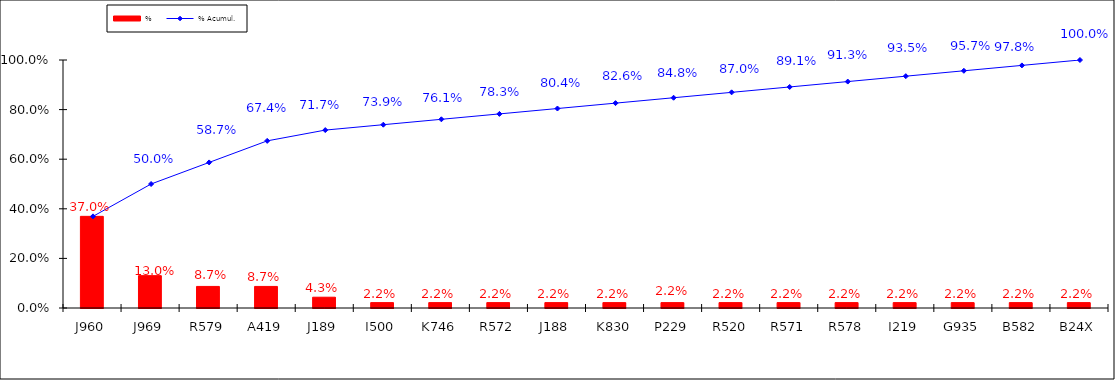
| Category | % |
|---|---|
| J960 | 0.37 |
| J969 | 0.13 |
| R579 | 0.087 |
| A419 | 0.087 |
| J189 | 0.043 |
| I500 | 0.022 |
| K746 | 0.022 |
| R572 | 0.022 |
| J188 | 0.022 |
| K830 | 0.022 |
| P229 | 0.022 |
| R520 | 0.022 |
| R571 | 0.022 |
| R578 | 0.022 |
| I219 | 0.022 |
| G935 | 0.022 |
| B582 | 0.022 |
| B24X | 0.022 |